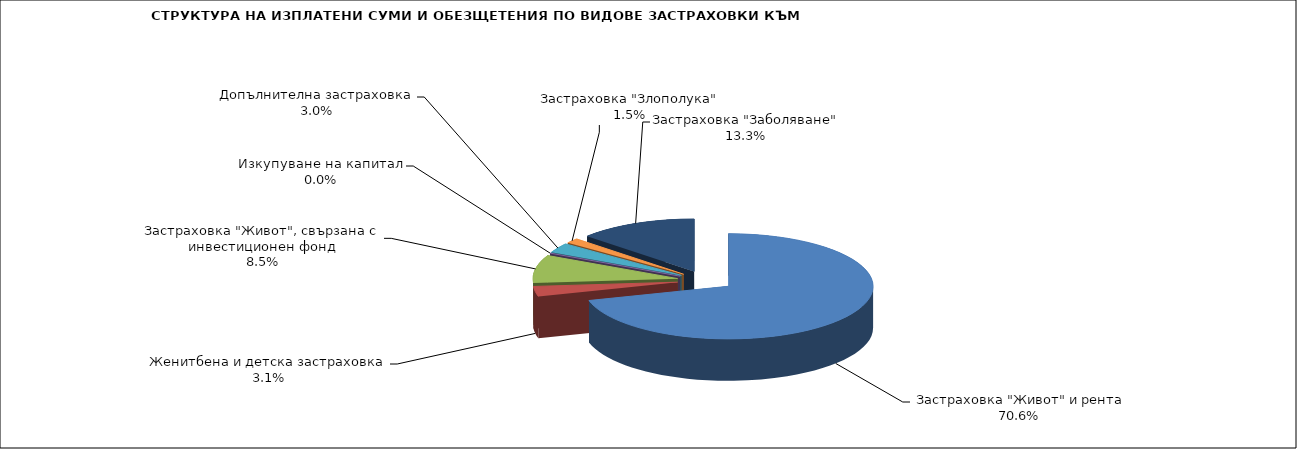
| Category |  Застраховка "Живот" и рента |
|---|---|
|  Застраховка "Живот" и рента | 114638841.766 |
| Женитбена и детска застраховка | 4968877.653 |
| Застраховка "Живот", свързана с инвестиционен фонд | 13857738.663 |
| Изкупуване на капитал | 0 |
| Допълнителна застраховка | 4843937.779 |
| Застраховка "Злополука" | 2484058.73 |
| Застраховка "Заболяване" | 21511806.945 |